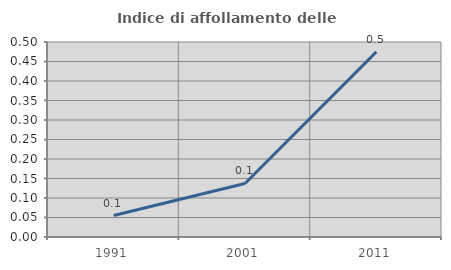
| Category | Indice di affollamento delle abitazioni  |
|---|---|
| 1991.0 | 0.055 |
| 2001.0 | 0.137 |
| 2011.0 | 0.475 |